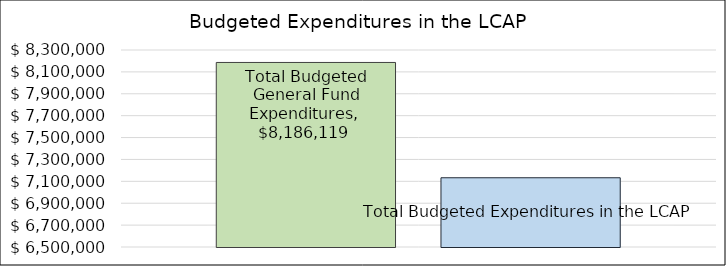
| Category | Total Budgeted General Fund Expenditures | Total Budgeted Expenditures in the LCAP |
|---|---|---|
| 0 | 8186119 | 7132732 |